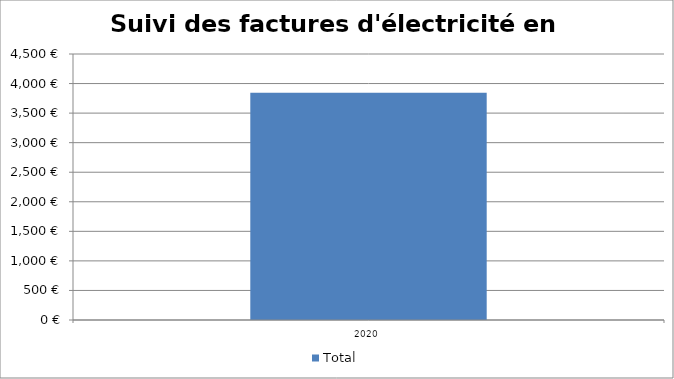
| Category | Total |
|---|---|
| 2020 | 3845 |